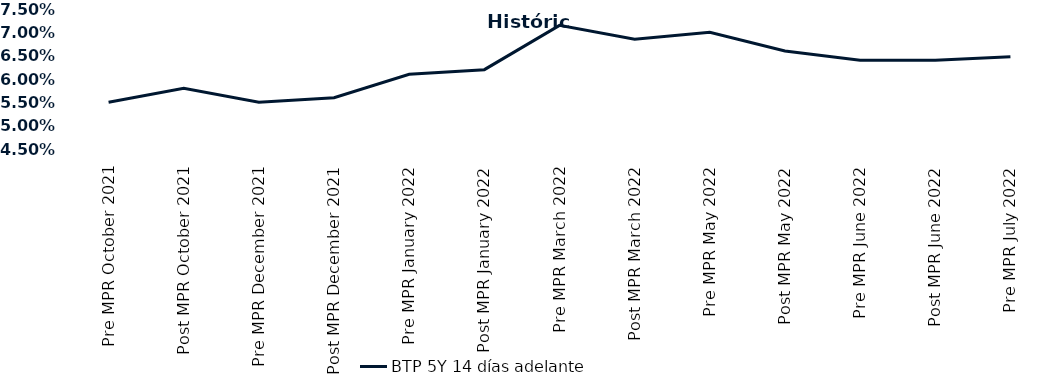
| Category | BTP 5Y 14 días adelante |
|---|---|
| Pre MPR October 2021 | 0.055 |
| Post MPR October 2021 | 0.058 |
| Pre MPR December 2021 | 0.055 |
| Post MPR December 2021 | 0.056 |
| Pre MPR January 2022 | 0.061 |
| Post MPR January 2022 | 0.062 |
| Pre MPR March 2022 | 0.072 |
| Post MPR March 2022 | 0.068 |
| Pre MPR May 2022 | 0.07 |
| Post MPR May 2022 | 0.066 |
| Pre MPR June 2022 | 0.064 |
| Post MPR June 2022 | 0.064 |
| Pre MPR July 2022 | 0.065 |